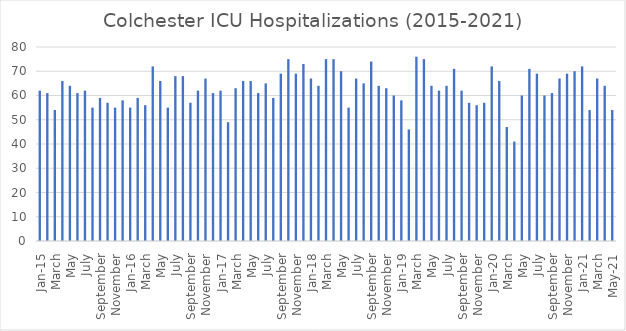
| Category | Series 0 |
|---|---|
| Jan-15 | 62 |
| February | 61 |
| March | 54 |
| April | 66 |
| May | 64 |
| June | 61 |
| July | 62 |
| August | 55 |
| September | 59 |
| October | 57 |
| November | 55 |
| Dec-15 | 58 |
| Jan-16 | 55 |
| February | 59 |
| March | 56 |
| April | 72 |
| May | 66 |
| June | 55 |
| July | 68 |
| August | 68 |
| September | 57 |
| October | 62 |
| November | 67 |
| Dec-16 | 61 |
| Jan-17 | 62 |
| February | 49 |
| March | 63 |
| April | 66 |
| May | 66 |
| June | 61 |
| July | 65 |
| August | 59 |
| September | 69 |
| October | 75 |
| November | 69 |
| Dec-17 | 73 |
| Jan-18 | 67 |
| February | 64 |
| March | 75 |
| April | 75 |
| May | 70 |
| June | 55 |
| July | 67 |
| August | 65 |
| September | 74 |
| October | 64 |
| November | 63 |
| Dec-18 | 60 |
| Jan-19 | 58 |
| February | 46 |
| March | 76 |
| April | 75 |
| May | 64 |
| June | 62 |
| July | 64 |
| August | 71 |
| September | 62 |
| October | 57 |
| November | 56 |
| Dec-19 | 57 |
| Jan-20 | 72 |
| February | 66 |
| March | 47 |
| April | 41 |
| May | 60 |
| June | 71 |
| July | 69 |
| August | 60 |
| September | 61 |
| October | 67 |
| November | 69 |
| Dec-20 | 70 |
| Jan-21 | 72 |
| February | 54 |
| March | 67 |
| April | 64 |
| May-21 | 54 |